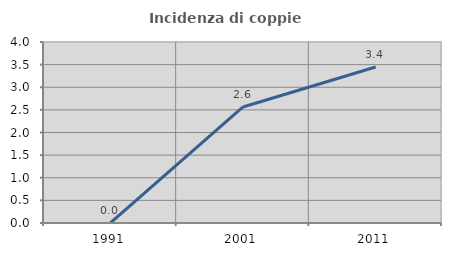
| Category | Incidenza di coppie miste |
|---|---|
| 1991.0 | 0 |
| 2001.0 | 2.564 |
| 2011.0 | 3.448 |